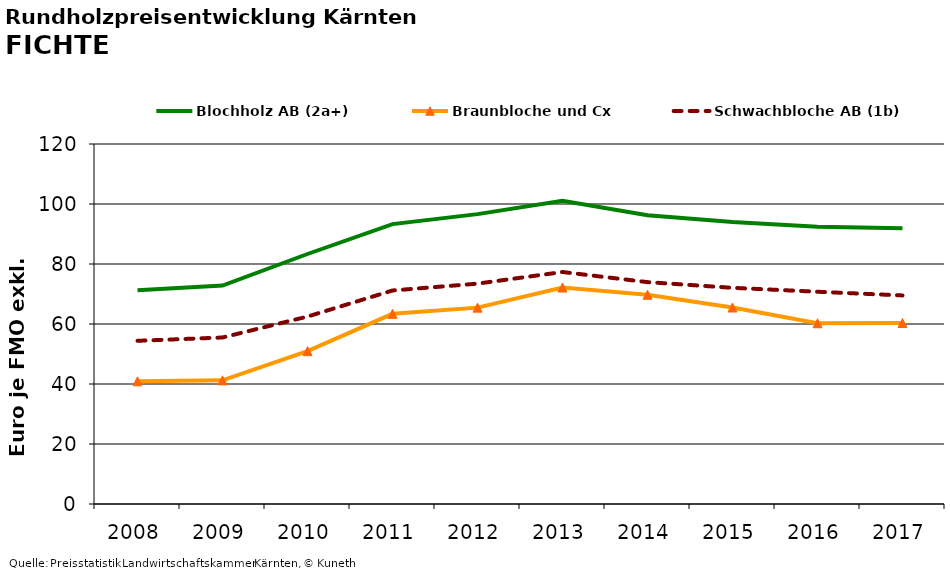
| Category | Blochholz AB (2a+) | Braunbloche und Cx | Schwachbloche AB (1b) |
|---|---|---|---|
| 2008.0 | 71.229 | 40.896 | 54.396 |
| 2009.0 | 72.799 | 41.229 | 55.5 |
| 2010.0 | 83.333 | 50.958 | 62.479 |
| 2011.0 | 93.292 | 63.396 | 71.167 |
| 2012.0 | 96.626 | 65.458 | 73.458 |
| 2013.0 | 101.086 | 72.167 | 77.333 |
| 2014.0 | 96.258 | 69.75 | 73.958 |
| 2015.0 | 94.029 | 65.5 | 72.062 |
| 2016.0 | 92.433 | 60.25 | 70.75 |
| 2017.0 | 91.951 | 60.354 | 69.521 |